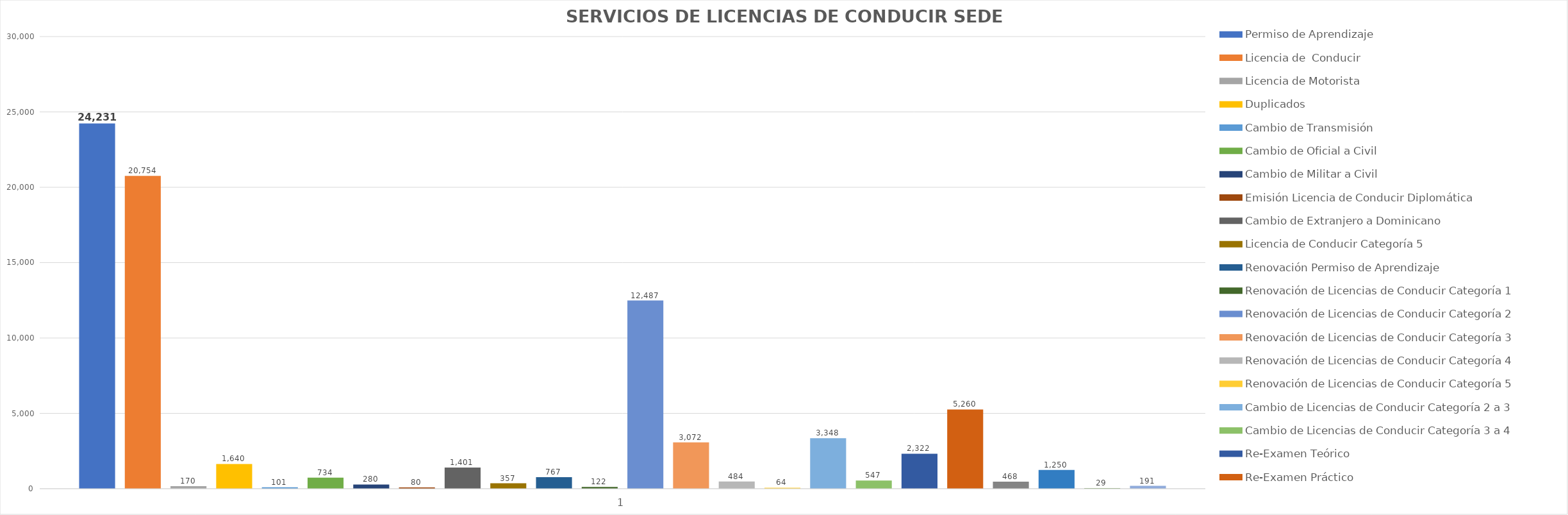
| Category | Permiso de Aprendizaje  | Licencia de  Conducir  | Licencia de Motorista | Duplicados  | Cambio de Transmisión  | Cambio de Oficial a Civil | Cambio de Militar a Civil | Emisión Licencia de Conducir Diplomática | Cambio de Extranjero a Dominicano | Licencia de Conducir Categoría 5 | Renovación Permiso de Aprendizaje | Renovación de Licencias de Conducir Categoría 1 | Renovación de Licencias de Conducir Categoría 2 | Renovación de Licencias de Conducir Categoría 3 | Renovación de Licencias de Conducir Categoría 4 | Renovación de Licencias de Conducir Categoría 5 | Cambio de Licencias de Conducir Categoría 2 a 3  | Cambio de Licencias de Conducir Categoría 3 a 4 | Re-Examen Teórico | Re-Examen Práctico | Licencia de  Conducir para Policia  | Renovación para Policia | Duplicados para Policia | Cambio de Categoría para Policia |
|---|---|---|---|---|---|---|---|---|---|---|---|---|---|---|---|---|---|---|---|---|---|---|---|---|
| 0 | 24231 | 20754 | 170 | 1640 | 101 | 734 | 280 | 80 | 1401 | 357 | 767 | 122 | 12487 | 3072 | 484 | 64 | 3348 | 547 | 2322 | 5260 | 468 | 1250 | 29 | 191 |